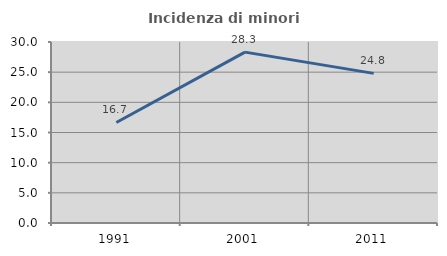
| Category | Incidenza di minori stranieri |
|---|---|
| 1991.0 | 16.667 |
| 2001.0 | 28.319 |
| 2011.0 | 24.8 |